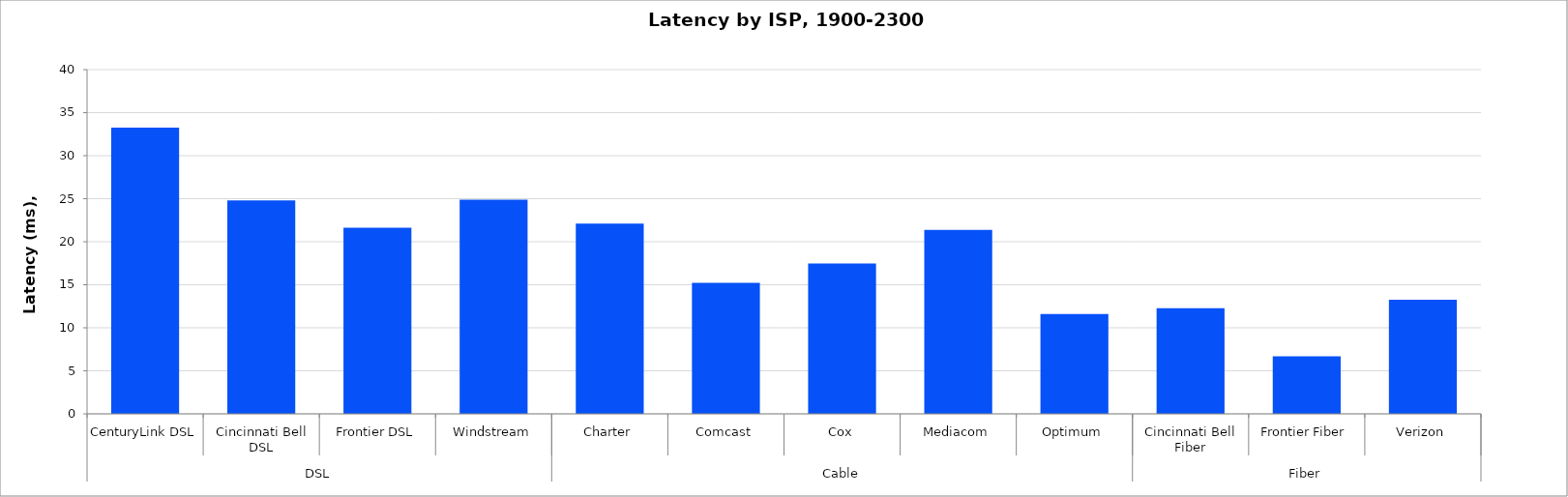
| Category | Series 0 |
|---|---|
| 0 | 33.254 |
| 1 | 24.802 |
| 2 | 21.623 |
| 3 | 24.886 |
| 4 | 22.11 |
| 5 | 15.227 |
| 6 | 17.469 |
| 7 | 21.381 |
| 8 | 11.599 |
| 9 | 12.289 |
| 10 | 6.679 |
| 11 | 13.251 |